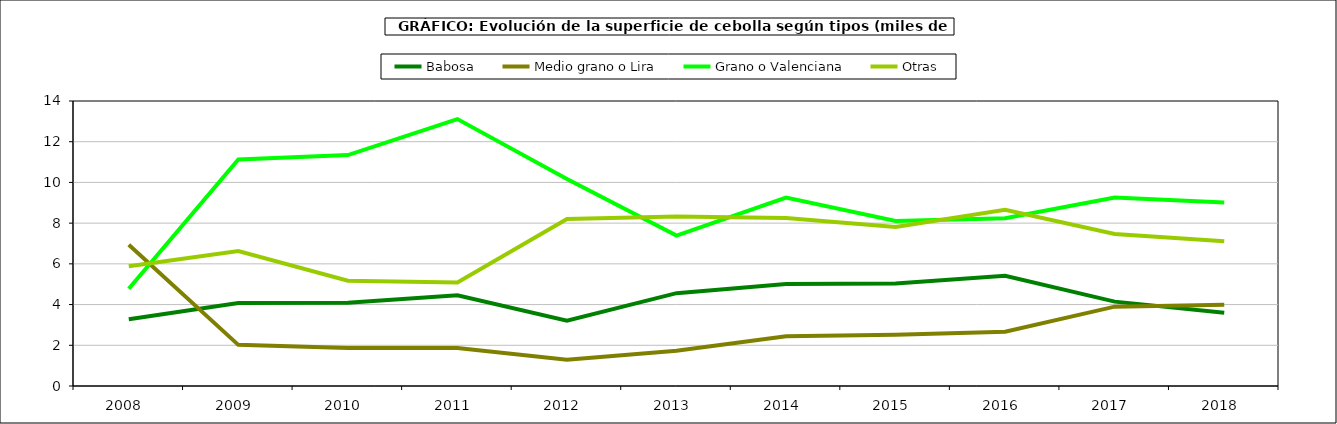
| Category | Babosa | Medio grano o Lira | Grano o Valenciana | Otras |
|---|---|---|---|---|
| 2008.0 | 3.278 | 6.937 | 4.775 | 5.878 |
| 2009.0 | 4.075 | 2.021 | 11.124 | 6.631 |
| 2010.0 | 4.091 | 1.869 | 11.342 | 5.176 |
| 2011.0 | 4.456 | 1.87 | 13.112 | 5.088 |
| 2012.0 | 3.212 | 1.284 | 10.171 | 8.2 |
| 2013.0 | 4.561 | 1.735 | 7.391 | 8.321 |
| 2014.0 | 5.014 | 2.441 | 9.254 | 8.252 |
| 2015.0 | 5.04 | 2.521 | 8.109 | 7.81 |
| 2016.0 | 5.414 | 2.662 | 8.238 | 8.655 |
| 2017.0 | 4.145 | 3.897 | 9.256 | 7.464 |
| 2018.0 | 3.6 | 3.987 | 9.012 | 7.113 |